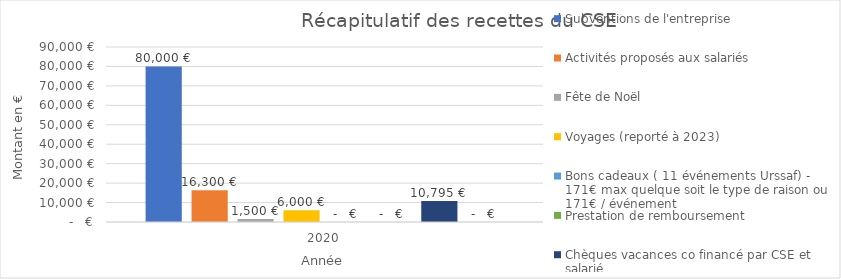
| Category | Subventions de l'entreprise  | Activités proposés aux salariés  | Fête de Noël | Voyages (reporté à 2023) | Bons cadeaux ( 11 événements Urssaf) - 171€ max quelque soit le type de raison ou 171€ / événement  | Prestation de remboursement | Chèques vacances co financé par CSE et salarié | Subvention de billetterie |
|---|---|---|---|---|---|---|---|---|
| 0 | 80000 | 16300 | 1500 | 6000 | 0 | 0 | 10795 | 0 |